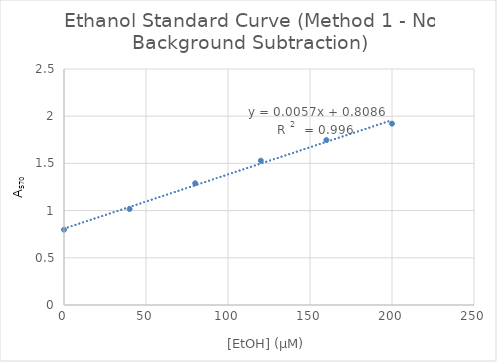
| Category | Series 0 |
|---|---|
| 0.0 | 0.798 |
| 40.0 | 1.017 |
| 80.0 | 1.289 |
| 120.0 | 1.529 |
| 160.0 | 1.747 |
| 200.0 | 1.921 |